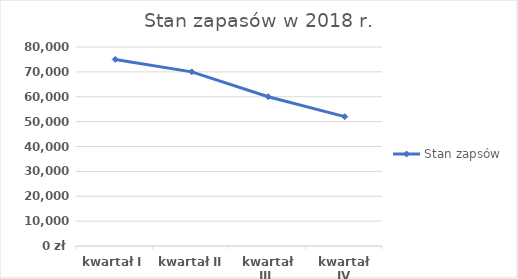
| Category | Stan zapsów |
|---|---|
| kwartał I | 75000 |
| kwartał II | 70000 |
| kwartał III  | 60000 |
| kwartał IV | 52000 |